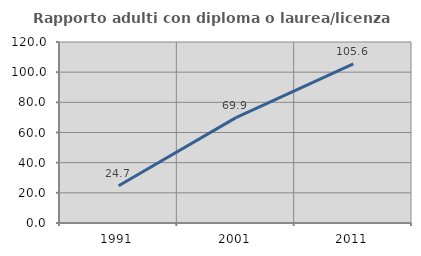
| Category | Rapporto adulti con diploma o laurea/licenza media  |
|---|---|
| 1991.0 | 24.675 |
| 2001.0 | 69.863 |
| 2011.0 | 105.556 |